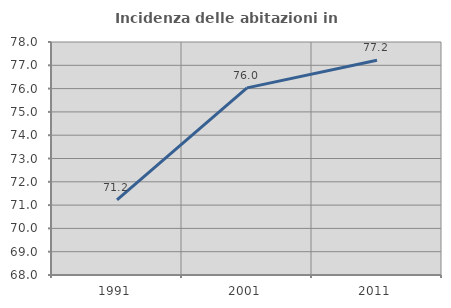
| Category | Incidenza delle abitazioni in proprietà  |
|---|---|
| 1991.0 | 71.227 |
| 2001.0 | 76.031 |
| 2011.0 | 77.218 |